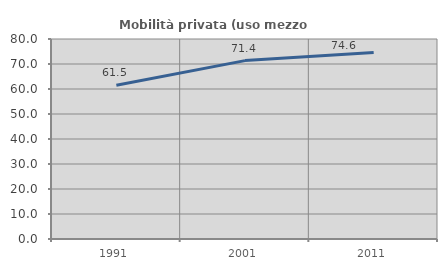
| Category | Mobilità privata (uso mezzo privato) |
|---|---|
| 1991.0 | 61.52 |
| 2001.0 | 71.358 |
| 2011.0 | 74.634 |